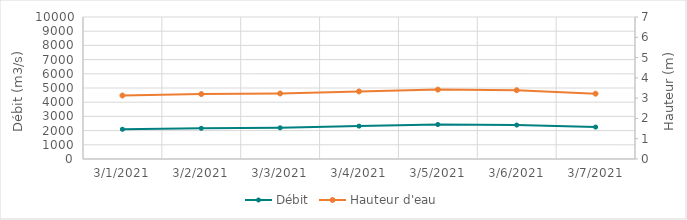
| Category | Débit |
|---|---|
| 2/18/21 | 2540.09 |
| 2/17/21 | 2719.77 |
| 2/16/21 | 2906.47 |
| 2/15/21 | 3089.79 |
| 2/14/21 | 3063.69 |
| 2/13/21 | 3227.1 |
| 2/12/21 | 3370.38 |